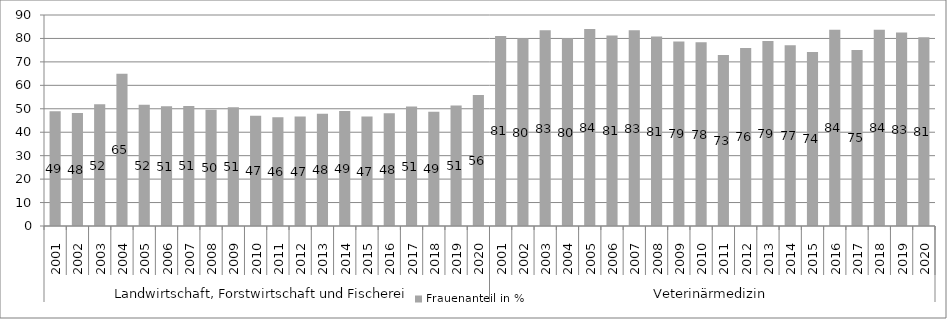
| Category | Frauenanteil in % |
|---|---|
| 0 | 48.895 |
| 1 | 48.182 |
| 2 | 51.901 |
| 3 | 64.96 |
| 4 | 51.721 |
| 5 | 51.089 |
| 6 | 51.197 |
| 7 | 49.565 |
| 8 | 50.685 |
| 9 | 47.041 |
| 10 | 46.425 |
| 11 | 46.747 |
| 12 | 47.83 |
| 13 | 49.089 |
| 14 | 46.737 |
| 15 | 48.077 |
| 16 | 50.98 |
| 17 | 48.693 |
| 18 | 51.396 |
| 19 | 55.888 |
| 20 | 81.05 |
| 21 | 80.054 |
| 22 | 83.495 |
| 23 | 80.097 |
| 24 | 83.986 |
| 25 | 81.25 |
| 26 | 83.459 |
| 27 | 80.827 |
| 28 | 78.673 |
| 29 | 78.369 |
| 30 | 72.965 |
| 31 | 75.931 |
| 32 | 78.889 |
| 33 | 77.077 |
| 34 | 74.219 |
| 35 | 83.74 |
| 36 | 75.093 |
| 37 | 83.75 |
| 38 | 82.558 |
| 39 | 80.531 |